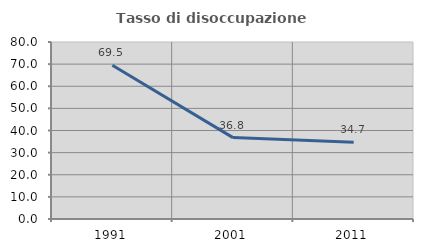
| Category | Tasso di disoccupazione giovanile  |
|---|---|
| 1991.0 | 69.524 |
| 2001.0 | 36.792 |
| 2011.0 | 34.677 |